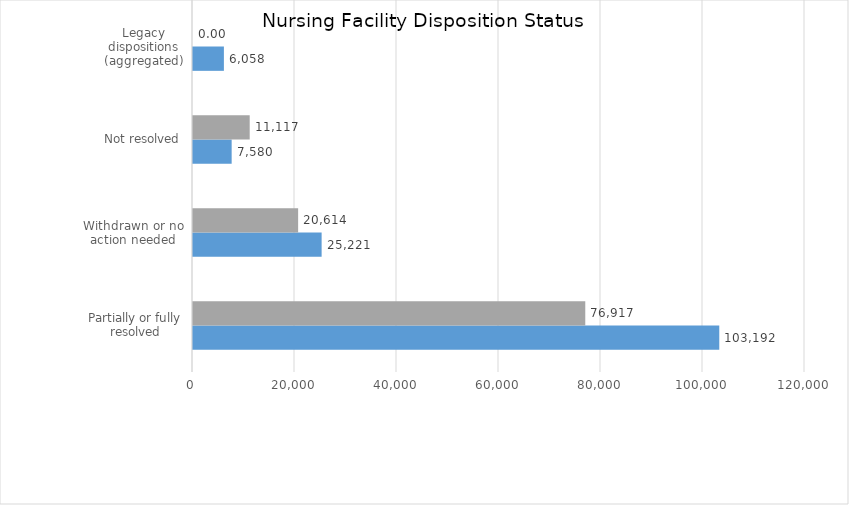
| Category | Nursing Facility 
FFY 2019 | Nursing Facility 
FFY 2020 |
|---|---|---|
| Partially or fully resolved | 103192 | 76917 |
| Withdrawn or no action needed | 25221 | 20614 |
| Not resolved | 7580 | 11117 |
| Legacy dispositions (aggregated) | 6058 | 0 |